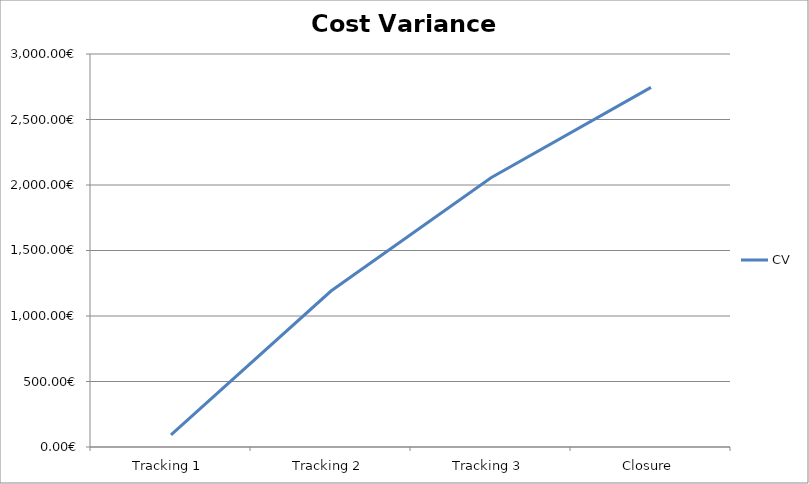
| Category | CV |
|---|---|
| Tracking 1 | 93 |
| Tracking 2 | 1190.7 |
| Tracking 3 | 2055.15 |
| Closure | 2745 |